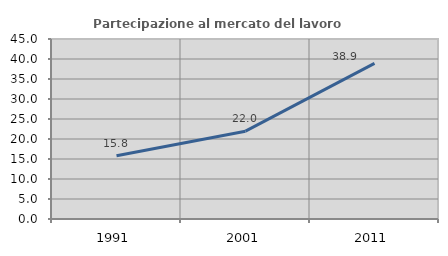
| Category | Partecipazione al mercato del lavoro  femminile |
|---|---|
| 1991.0 | 15.789 |
| 2001.0 | 21.951 |
| 2011.0 | 38.889 |